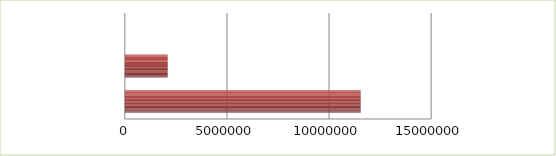
| Category | Series 0 | Series 1 |
|---|---|---|
| 0 | 2.5 | 11550000 |
| 1 | 2.6 | 2100000 |
| 2 | 2.7 | 0 |